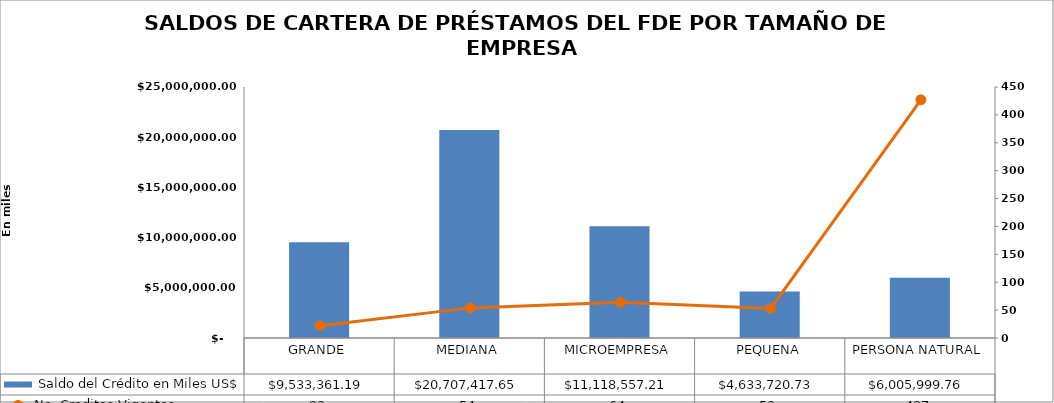
| Category |  Saldo del Crédito en Miles US$ |
|---|---|
| GRANDE | 9533361.19 |
| MEDIANA | 20707417.65 |
| MICROEMPRESA | 11118557.21 |
| PEQUENA | 4633720.73 |
| PERSONA NATURAL | 6005999.76 |